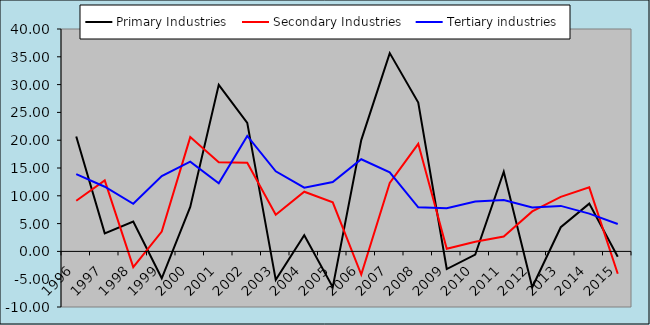
| Category | Primary Industries | Secondary Industries | Tertiary industries |
|---|---|---|---|
| 1996.0 | 20.668 | 9.098 | 13.903 |
| 1997.0 | 3.247 | 12.782 | 11.635 |
| 1998.0 | 5.36 | -2.838 | 8.557 |
| 1999.0 | -4.829 | 3.555 | 13.544 |
| 2000.0 | 7.992 | 20.556 | 16.131 |
| 2001.0 | 29.947 | 16.031 | 12.235 |
| 2002.0 | 23.112 | 15.963 | 20.774 |
| 2003.0 | -5.12 | 6.601 | 14.408 |
| 2004.0 | 2.891 | 10.737 | 11.46 |
| 2005.0 | -6.439 | 8.829 | 12.474 |
| 2006.0 | 20.019 | -4.155 | 16.572 |
| 2007.0 | 35.666 | 12.299 | 14.231 |
| 2008.0 | 26.766 | 19.348 | 7.935 |
| 2009.0 | -3.17 | 0.489 | 7.777 |
| 2010.0 | -0.571 | 1.733 | 8.97 |
| 2011.0 | 14.318 | 2.684 | 9.26 |
| 2012.0 | -6.438 | 7.184 | 7.91 |
| 2013.0 | 4.346 | 9.807 | 8.185 |
| 2014.0 | 8.59 | 11.526 | 6.795 |
| 2015.0 | -0.96 | -4.009 | 4.937 |